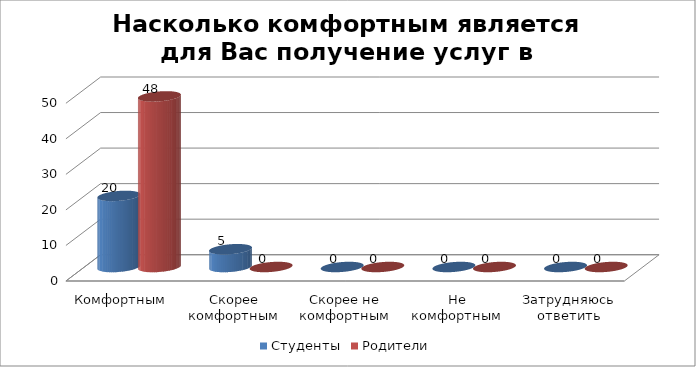
| Category | Студенты | Родители |
|---|---|---|
| Комфортным | 20 | 48 |
| Скорее комфортным | 5 | 0 |
| Скорее не комфортным | 0 | 0 |
| Не комфортным | 0 | 0 |
| Затрудняюсь ответить | 0 | 0 |